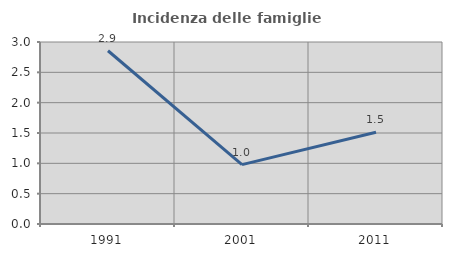
| Category | Incidenza delle famiglie numerose |
|---|---|
| 1991.0 | 2.856 |
| 2001.0 | 0.979 |
| 2011.0 | 1.513 |